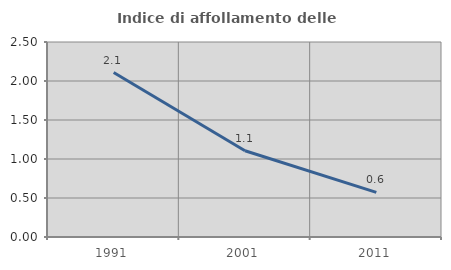
| Category | Indice di affollamento delle abitazioni  |
|---|---|
| 1991.0 | 2.109 |
| 2001.0 | 1.106 |
| 2011.0 | 0.572 |